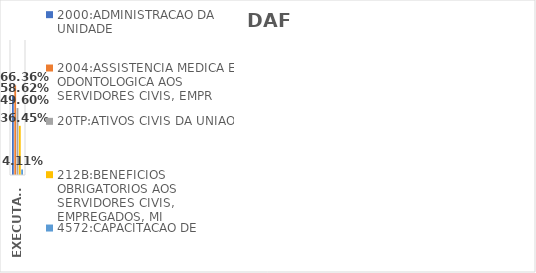
| Category | 2000:ADMINISTRACAO DA UNIDADE | 2004:ASSISTENCIA MEDICA E ODONTOLOGICA AOS SERVIDORES CIVIS, EMPR | 20TP:ATIVOS CIVIS DA UNIAO | 212B:BENEFICIOS OBRIGATORIOS AOS SERVIDORES CIVIS, EMPREGADOS, MI | 4572:CAPACITACAO DE SERVIDORES PUBLICOS FEDERAIS EM PROCESSO DE Q |
|---|---|---|---|---|---|
| EXECUTADO | 0.586 | 0.664 | 0.496 | 0.364 | 0.041 |